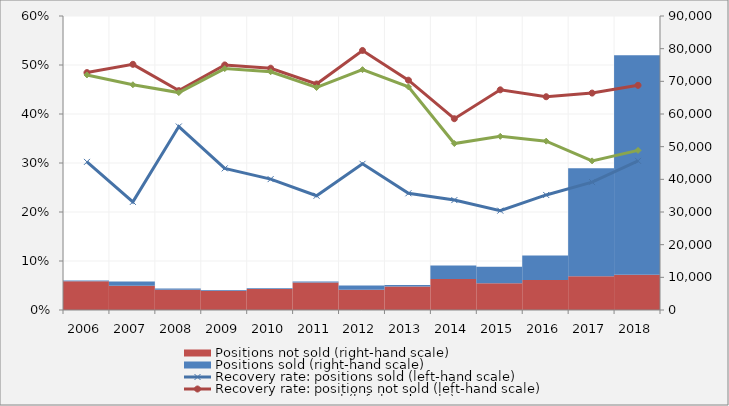
| Category | Positions not sold (right-hand scale) | Positions sold (right-hand scale) |
|---|---|---|
| 2006.0 | 8803040402 | 236068123 |
| 2007.0 | 7442770518 | 1298764521 |
| 2008.0 | 6225493473 | 354965552 |
| 2009.0 | 5892617853 | 216283928 |
| 2010.0 | 6454267206 | 212601734 |
| 2011.0 | 8441794414 | 276187901 |
| 2012.0 | 6206683948 | 1265786059 |
| 2013.0 | 7228959124 | 454084164 |
| 2014.0 | 9462846090 | 4149678117 |
| 2015.0 | 8157372643 | 5100781018 |
| 2016.0 | 9154968848 | 7557258123 |
| 2017.0 | 10348998626 | 33010733708 |
| 2018.0 | 10794203636 | 67222799218 |